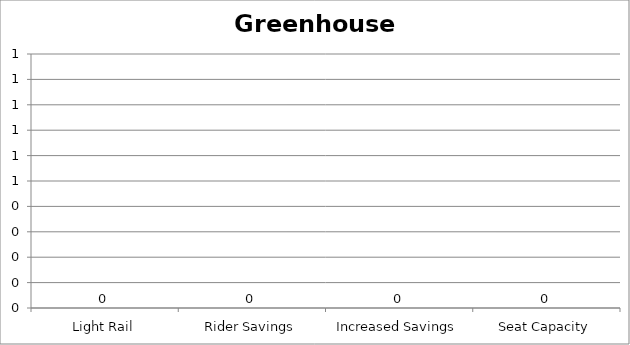
| Category | Greenhouse Gas |
|---|---|
| Light Rail | 0 |
| Rider Savings | 0 |
| Increased Savings | 0 |
| Seat Capacity | 0 |